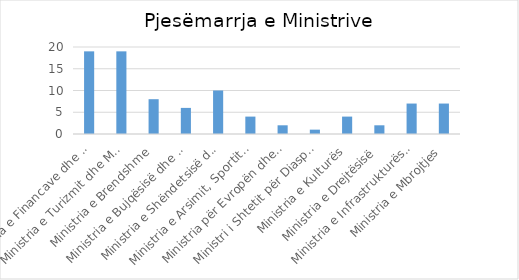
| Category | Total |
|---|---|
| Ministria e Financave dhe Ekonomisë | 19 |
| Ministria e Turizmit dhe Mjedisit | 19 |
| Ministria e Brendshme | 8 |
| Ministria e Bujqësisë dhe Zhvillimit Rural | 6 |
| Ministria e Shëndetsisë dhe Mbrojtjes Sociale | 10 |
| Ministria e Arsimit, Sportit dhe Rinisë | 4 |
| Ministria për Evropën dhe Punët e Jashtme | 2 |
| Ministri i Shtetit për Diasporën | 1 |
| Ministria e Kulturës | 4 |
| Ministria e Drejtësisë | 2 |
| Ministria e Infrastrukturës dhe Energjisë | 7 |
| Ministria e Mbrojtjes | 7 |